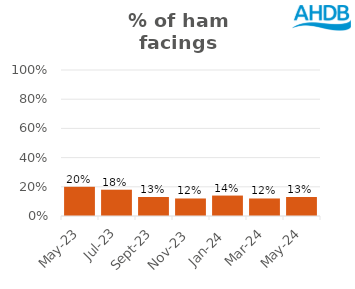
| Category | Ham |
|---|---|
| 2023-05-01 | 0.2 |
| 2023-07-01 | 0.18 |
| 2023-09-01 | 0.13 |
| 2023-11-01 | 0.12 |
| 2024-01-01 | 0.14 |
| 2024-03-01 | 0.12 |
| 2024-05-01 | 0.13 |